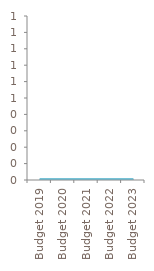
| Category | Series 0 |
|---|---|
| Budget 2019 | 0 |
| Budget 2020 | 0 |
| Budget 2021 | 0 |
| Budget 2022 | 0 |
| Budget 2023 | 0 |